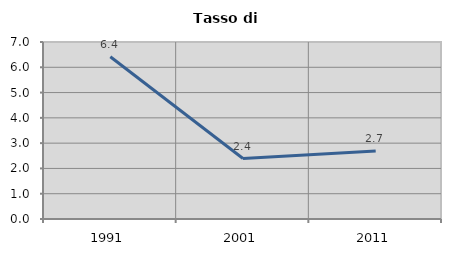
| Category | Tasso di disoccupazione   |
|---|---|
| 1991.0 | 6.415 |
| 2001.0 | 2.39 |
| 2011.0 | 2.692 |